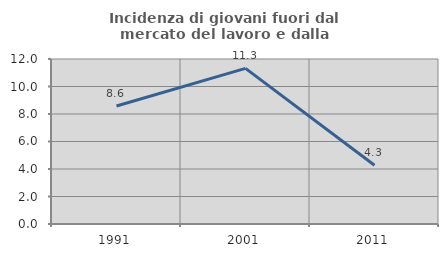
| Category | Incidenza di giovani fuori dal mercato del lavoro e dalla formazione  |
|---|---|
| 1991.0 | 8.581 |
| 2001.0 | 11.321 |
| 2011.0 | 4.268 |